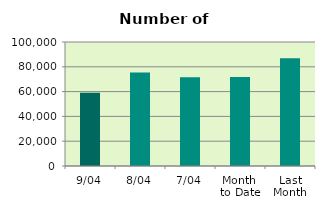
| Category | Series 0 |
|---|---|
| 9/04 | 58992 |
| 8/04 | 75310 |
| 7/04 | 71524 |
| Month 
to Date | 71779.2 |
| Last
Month | 86968.783 |